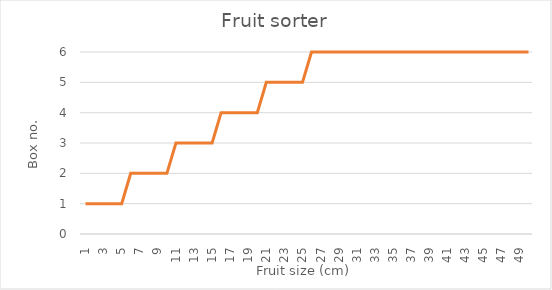
| Category | Box no. |
|---|---|
| 1.0 | 1 |
| 2.0 | 1 |
| 3.0 | 1 |
| 4.0 | 1 |
| 5.0 | 1 |
| 6.0 | 2 |
| 7.0 | 2 |
| 8.0 | 2 |
| 9.0 | 2 |
| 10.0 | 2 |
| 11.0 | 3 |
| 12.0 | 3 |
| 13.0 | 3 |
| 14.0 | 3 |
| 15.0 | 3 |
| 16.0 | 4 |
| 17.0 | 4 |
| 18.0 | 4 |
| 19.0 | 4 |
| 20.0 | 4 |
| 21.0 | 5 |
| 22.0 | 5 |
| 23.0 | 5 |
| 24.0 | 5 |
| 25.0 | 5 |
| 26.0 | 6 |
| 27.0 | 6 |
| 28.0 | 6 |
| 29.0 | 6 |
| 30.0 | 6 |
| 31.0 | 6 |
| 32.0 | 6 |
| 33.0 | 6 |
| 34.0 | 6 |
| 35.0 | 6 |
| 36.0 | 6 |
| 37.0 | 6 |
| 38.0 | 6 |
| 39.0 | 6 |
| 40.0 | 6 |
| 41.0 | 6 |
| 42.0 | 6 |
| 43.0 | 6 |
| 44.0 | 6 |
| 45.0 | 6 |
| 46.0 | 6 |
| 47.0 | 6 |
| 48.0 | 6 |
| 49.0 | 6 |
| 50.0 | 6 |